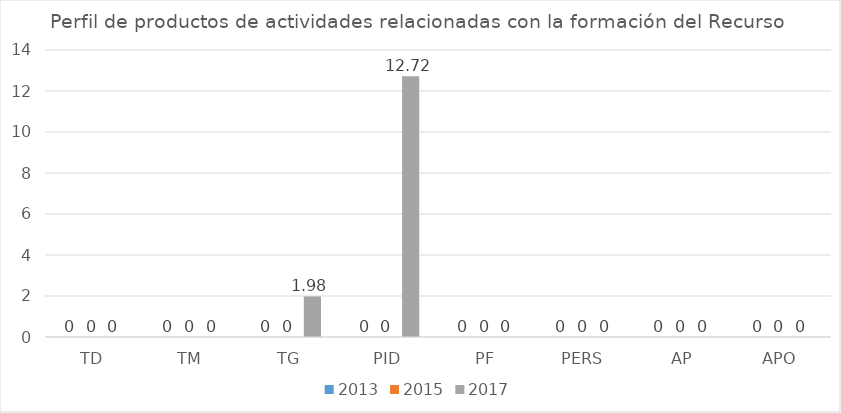
| Category | 2013 | 2015 | 2017 |
|---|---|---|---|
| TD | 0 | 0 | 0 |
| TM | 0 | 0 | 0 |
| TG | 0 | 0 | 1.98 |
| PID | 0 | 0 | 12.72 |
| PF | 0 | 0 | 0 |
| PERS | 0 | 0 | 0 |
| AP | 0 | 0 | 0 |
| APO | 0 | 0 | 0 |